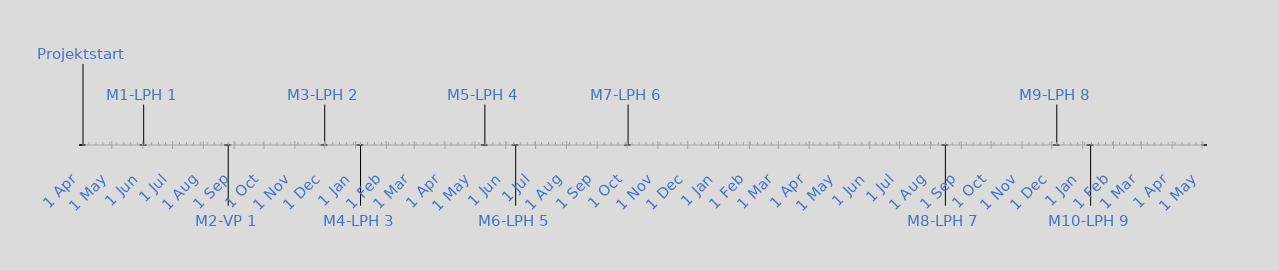
| Category | Position |
|---|---|
| Projektstart | 20 |
| M1-LPH 1 | 10 |
| M2-VP 1 | -15 |
| M3-LPH 2 | 10 |
| M4-LPH 3 | -15 |
| M5-LPH 4 | 10 |
| M6-LPH 5 | -15 |
| M7-LPH 6 | 10 |
| M8-LPH 7 | -15 |
| M9-LPH 8 | 10 |
| M10-LPH 9 | -15 |
| Projektende | 20 |